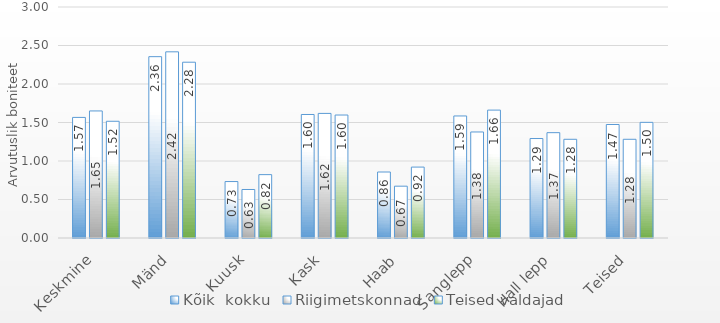
| Category | Kõik  kokku | Riigimetskonnad | Teised valdajad |
|---|---|---|---|
| Keskmine | 1.566 | 1.65 | 1.516 |
| Mänd | 2.355 | 2.418 | 2.283 |
| Kuusk | 0.733 | 0.63 | 0.823 |
| Kask | 1.604 | 1.618 | 1.597 |
| Haab | 0.857 | 0.673 | 0.921 |
| Sanglepp | 1.585 | 1.377 | 1.661 |
| Hall lepp | 1.292 | 1.368 | 1.282 |
| Teised | 1.474 | 1.282 | 1.502 |